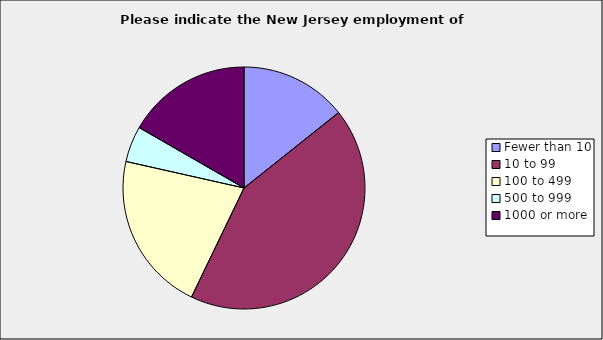
| Category | Series 0 |
|---|---|
| Fewer than 10 | 0.143 |
| 10 to 99 | 0.429 |
| 100 to 499 | 0.214 |
| 500 to 999 | 0.048 |
| 1000 or more | 0.167 |